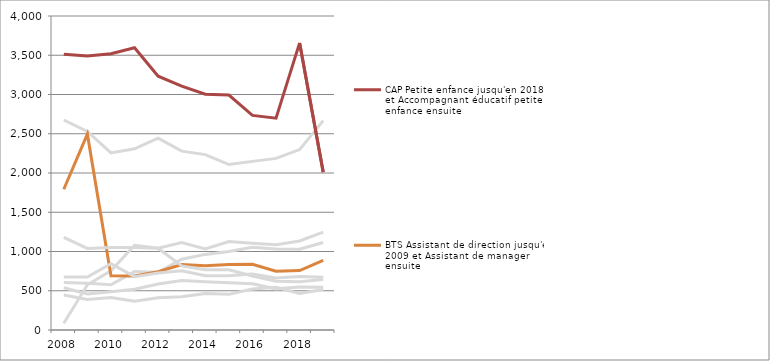
| Category | DEES | CAP Petite enfance jusqu'en 2018 et Accompagnant éducatif petite enfance ensuite | DEME | BTS Management des unités commerciales | BTS Assistant de direction jusqu'en 2009 et Assistant de manager ensuite | BTS Assistant de gestion de PME-PMI, à référentiel commun européen depuis 2011 | BP Coiffure, rénové à partir de 2013 | Baccalauréat professionnel Commerce | BTS Négociation et relation client |
|---|---|---|---|---|---|---|---|---|---|
| 2008.0 | 2675 | 3513 | 87 | 605 | 1793 | 676 | 1179 | 538 | 445 |
| 2009.0 | 2529 | 3489 | 576 | 597 | 2495 | 674 | 1039 | 458 | 390 |
| 2010.0 | 2256 | 3520 | 755 | 577 | 691 | 844 | 1050 | 487 | 413 |
| 2011.0 | 2308 | 3596 | 1079 | 744 | 689 | 680 | 1052 | 519 | 368 |
| 2012.0 | 2443 | 3233 | 1042 | 736 | 743 | 725 | 1042 | 586 | 411 |
| 2013.0 | 2278 | 3106 | 1113 | 902 | 833 | 754 | 816 | 631 | 424 |
| 2014.0 | 2234 | 3003 | 1032 | 963 | 818 | 690 | 768 | 615 | 464 |
| 2015.0 | 2108 | 2993 | 1126 | 1000 | 835 | 691 | 768 | 602 | 454 |
| 2016.0 | 2148 | 2734 | 1106 | 1054 | 838 | 713 | 687 | 589 | 522 |
| 2017.0 | 2186 | 2698 | 1086 | 1032 | 749 | 664 | 621 | 524 | 544 |
| 2018.0 | 2298 | 3657 | 1134 | 1029 | 757 | 680 | 615 | 548 | 464 |
| 2019.0 | 2667 | 2011 | 1248 | 1114 | 886 | 673 | 644 | 545 | 516 |